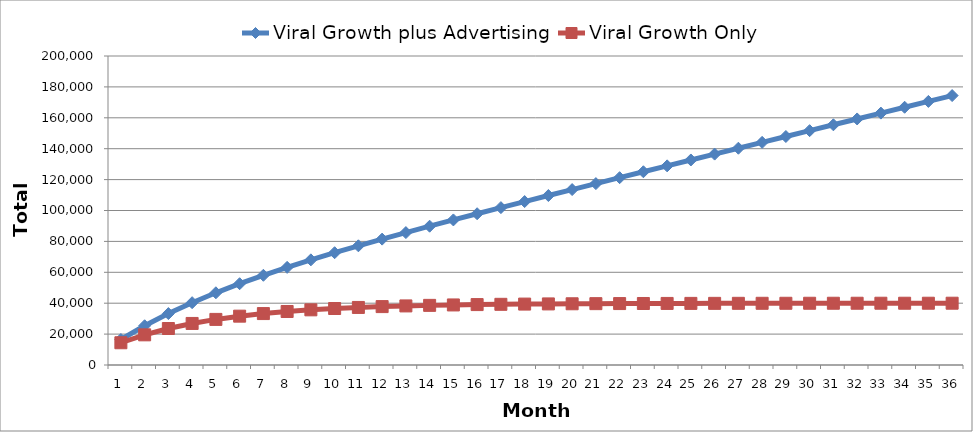
| Category | Viral Growth plus Advertising | Viral Growth Only |
|---|---|---|
| 1 | 16500 | 14400 |
| 2 | 25400 | 19520 |
| 3 | 33276 | 23616 |
| 4 | 40332.8 | 26892.8 |
| 5 | 46734.24 | 29514.24 |
| 6 | 52611.392 | 31611.392 |
| 7 | 58069.114 | 33289.114 |
| 8 | 63191.291 | 34631.291 |
| 9 | 68045.033 | 35705.033 |
| 10 | 72684.026 | 36564.026 |
| 11 | 77151.221 | 37251.221 |
| 12 | 81480.977 | 37800.977 |
| 13 | 85700.781 | 38240.781 |
| 14 | 89832.625 | 38592.625 |
| 15 | 93894.1 | 38874.1 |
| 16 | 97899.28 | 39099.28 |
| 17 | 101859.424 | 39279.424 |
| 18 | 105783.539 | 39423.539 |
| 19 | 109678.831 | 39538.831 |
| 20 | 113551.065 | 39631.065 |
| 21 | 117404.852 | 39704.852 |
| 22 | 121243.882 | 39763.882 |
| 23 | 125071.105 | 39811.105 |
| 24 | 128888.884 | 39848.884 |
| 25 | 132699.107 | 39879.107 |
| 26 | 136503.286 | 39903.286 |
| 27 | 140302.629 | 39922.629 |
| 28 | 144098.103 | 39938.103 |
| 29 | 147890.482 | 39950.482 |
| 30 | 151680.386 | 39960.386 |
| 31 | 155468.309 | 39968.309 |
| 32 | 159254.647 | 39974.647 |
| 33 | 163039.718 | 39979.718 |
| 34 | 166823.774 | 39983.774 |
| 35 | 170607.019 | 39987.019 |
| 36 | 174389.615 | 39989.615 |